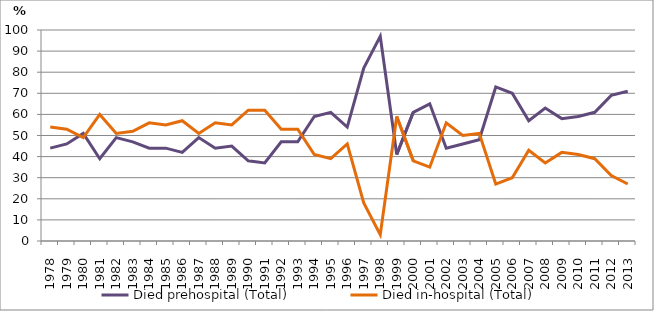
| Category | Died prehospital (Total) | Died in-hospital (Total) |
|---|---|---|
| 1978.0 | 44 | 54 |
| 1979.0 | 46 | 53 |
| 1980.0 | 51 | 49 |
| 1981.0 | 39 | 60 |
| 1982.0 | 49 | 51 |
| 1983.0 | 47 | 52 |
| 1984.0 | 44 | 56 |
| 1985.0 | 44 | 55 |
| 1986.0 | 42 | 57 |
| 1987.0 | 49 | 51 |
| 1988.0 | 44 | 56 |
| 1989.0 | 45 | 55 |
| 1990.0 | 38 | 62 |
| 1991.0 | 37 | 62 |
| 1992.0 | 47 | 53 |
| 1993.0 | 47 | 53 |
| 1994.0 | 59 | 41 |
| 1995.0 | 61 | 39 |
| 1996.0 | 54 | 46 |
| 1997.0 | 82 | 18 |
| 1998.0 | 97 | 3 |
| 1999.0 | 41 | 59 |
| 2000.0 | 61 | 38 |
| 2001.0 | 65 | 35 |
| 2002.0 | 44 | 56 |
| 2003.0 | 46 | 50 |
| 2004.0 | 48 | 51 |
| 2005.0 | 73 | 27 |
| 2006.0 | 70 | 30 |
| 2007.0 | 57 | 43 |
| 2008.0 | 63 | 37 |
| 2009.0 | 58 | 42 |
| 2010.0 | 59 | 41 |
| 2011.0 | 61 | 39 |
| 2012.0 | 69 | 31 |
| 2013.0 | 71 | 27 |